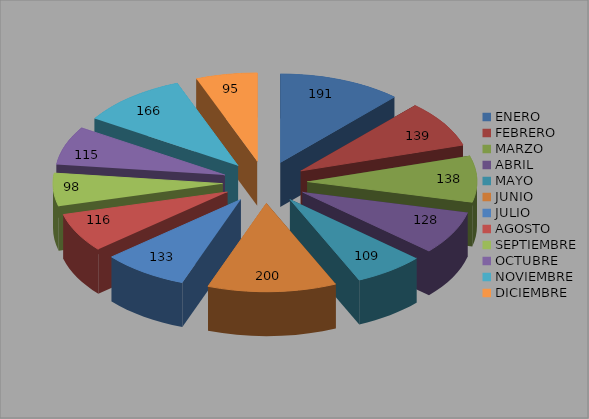
| Category | Series 0 |
|---|---|
| ENERO | 191 |
| FEBRERO | 139 |
| MARZO | 138 |
| ABRIL | 128 |
| MAYO | 109 |
| JUNIO | 200 |
| JULIO | 133 |
| AGOSTO | 116 |
| SEPTIEMBRE | 98 |
| OCTUBRE | 115 |
| NOVIEMBRE | 166 |
| DICIEMBRE | 95 |